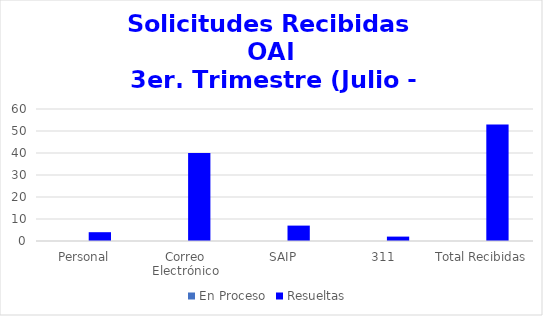
| Category | En Proceso | Resueltas  |
|---|---|---|
| Personal | 0 | 4 |
| Correo Electrónico | 0 | 40 |
| SAIP | 0 | 7 |
| 311 | 0 | 2 |
| Total Recibidas | 0 | 53 |